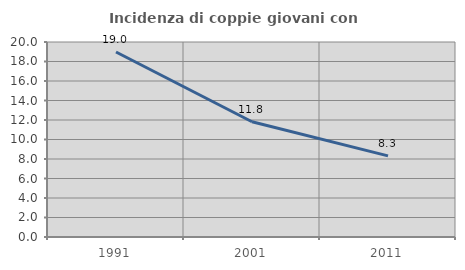
| Category | Incidenza di coppie giovani con figli |
|---|---|
| 1991.0 | 18.978 |
| 2001.0 | 11.824 |
| 2011.0 | 8.324 |